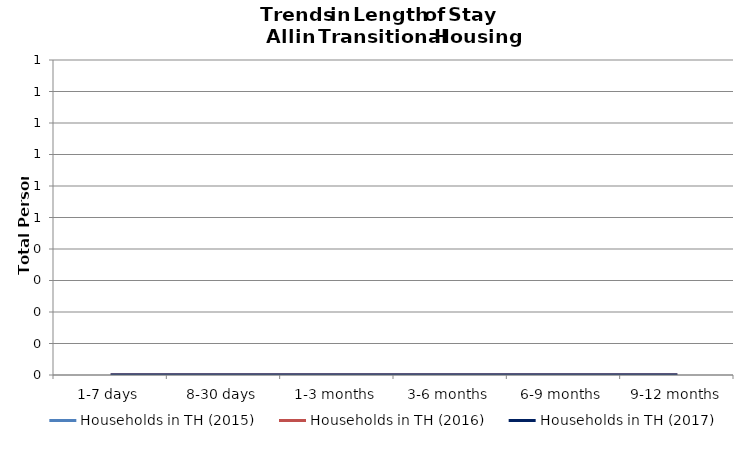
| Category | Households in TH (2015) | Households in TH (2016) | Households in TH (2017) |
|---|---|---|---|
| 1-7 days | 0 | 0 | 0 |
| 8-30 days | 0 | 0 | 0 |
| 1-3 months | 0 | 0 | 0 |
| 3-6 months | 0 | 0 | 0 |
| 6-9 months | 0 | 0 | 0 |
| 9-12 months | 0 | 0 | 0 |